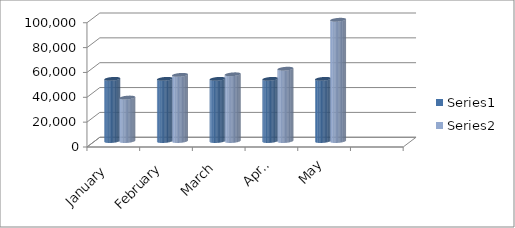
| Category | Series 0 | Series 1 |
|---|---|---|
| January  | 50000 | 34954 |
| February | 50000 | 53205 |
| March | 50000 | 53670 |
| April | 50000 | 58160 |
| May | 50000 | 97564 |